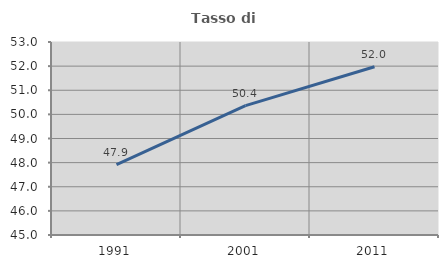
| Category | Tasso di occupazione   |
|---|---|
| 1991.0 | 47.92 |
| 2001.0 | 50.364 |
| 2011.0 | 51.974 |